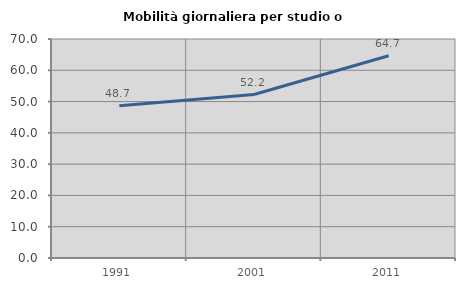
| Category | Mobilità giornaliera per studio o lavoro |
|---|---|
| 1991.0 | 48.663 |
| 2001.0 | 52.241 |
| 2011.0 | 64.664 |